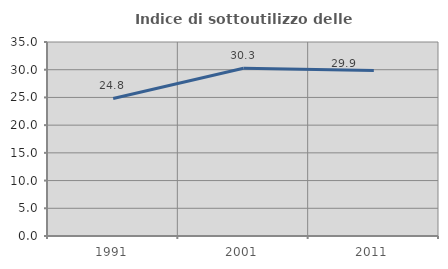
| Category | Indice di sottoutilizzo delle abitazioni  |
|---|---|
| 1991.0 | 24.809 |
| 2001.0 | 30.252 |
| 2011.0 | 29.858 |